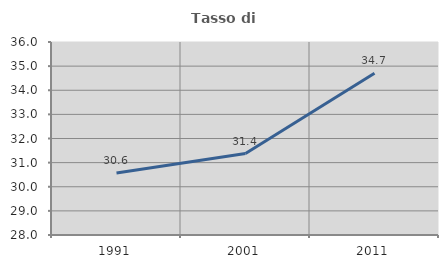
| Category | Tasso di occupazione   |
|---|---|
| 1991.0 | 30.574 |
| 2001.0 | 31.376 |
| 2011.0 | 34.705 |